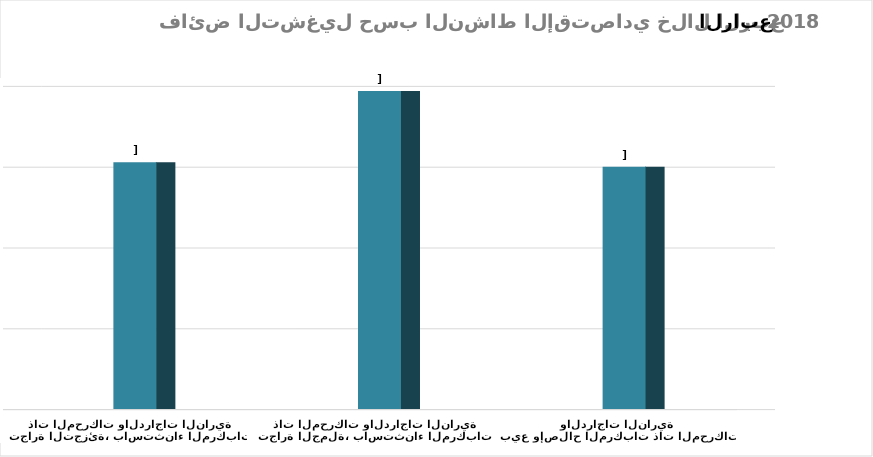
| Category | Series 0 |
|---|---|
| بيع وإصلاح المركبات ذات المحركات والدراجات النارية | 14998513216.653 |
| تجارة الجملة، باستثناء المركبات ذات المحركات والدراجات النارية | 19674680835.99 |
| تجارة التجزئة، باستثناء المركبات ذات المحركات والدراجات النارية | 15276202189.576 |